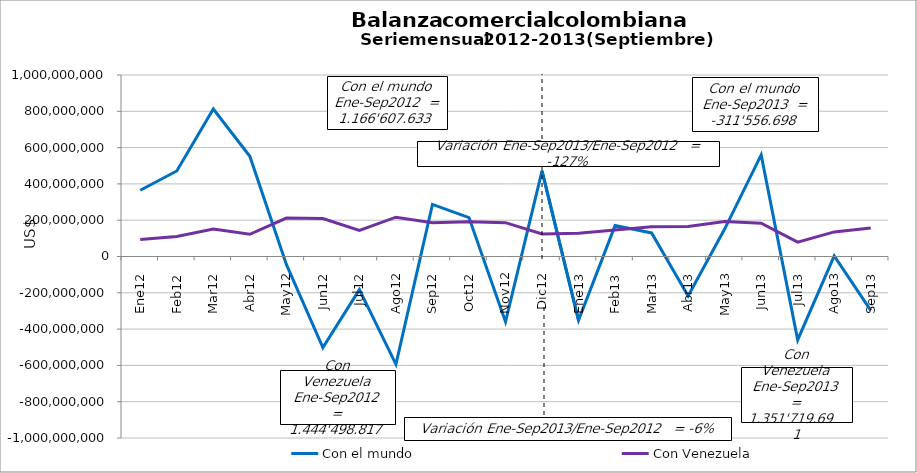
| Category | Con el mundo | Con Venezuela |
|---|---|---|
| 0 | 365236896.39 | 93858672.02 |
| 1 | 471254376.48 | 109738215.24 |
| 2 | 812672155.33 | 151812649.39 |
| 3 | 552212453.87 | 122425519.04 |
| 4 | -43303050.56 | 212017125.93 |
| 5 | -501300545.37 | 209481631.62 |
| 6 | -182769268.25 | 143082389.37 |
| 7 | -594402576.84 | 216556277.39 |
| 8 | 287007192.43 | 185526336.5 |
| 9 | 214327872.41 | 190804002.69 |
| 10 | -359526323.33 | 186574453.63 |
| 11 | 471322651.54 | 124628013.35 |
| 12 | -351699235.93 | 128645062.81 |
| 13 | 170276250.68 | 146192658.83 |
| 14 | 129706117.85 | 163993778.86 |
| 15 | -217650665.27 | 165112981.22 |
| 16 | 151125826.62 | 193006986.66 |
| 17 | 559734024.39 | 183585537.7 |
| 18 | -459551452.93 | 78788640.58 |
| 19 | 3446839.04 | 135435050.46 |
| 20 | -296944402.01 | 156958993.57 |